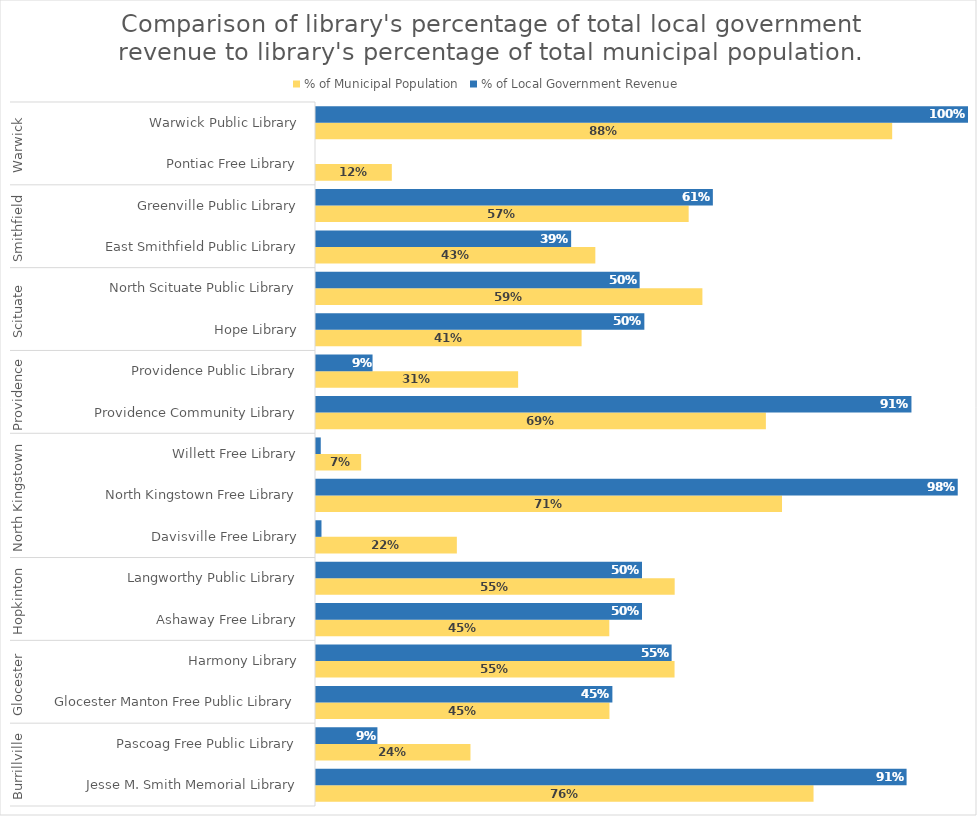
| Category | % of Municipal Population | % of Local Government Revenue |
|---|---|---|
| 0 | 0.763 | 0.906 |
| 1 | 0.237 | 0.094 |
| 2 | 0.45 | 0.455 |
| 3 | 0.55 | 0.545 |
| 4 | 0.45 | 0.5 |
| 5 | 0.55 | 0.5 |
| 6 | 0.216 | 0.008 |
| 7 | 0.715 | 0.984 |
| 8 | 0.069 | 0.007 |
| 9 | 0.69 | 0.913 |
| 10 | 0.31 | 0.087 |
| 11 | 0.407 | 0.504 |
| 12 | 0.593 | 0.496 |
| 13 | 0.428 | 0.391 |
| 14 | 0.572 | 0.609 |
| 15 | 0.116 | 0 |
| 16 | 0.884 | 1 |